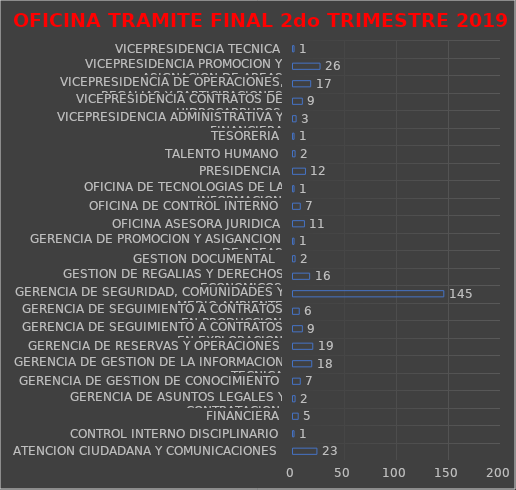
| Category | Series 0 |
|---|---|
| ATENCION CIUDADANA Y COMUNICACIONES | 23 |
| CONTROL INTERNO DISCIPLINARIO | 1 |
| FINANCIERA | 5 |
| GERENCIA DE ASUNTOS LEGALES Y CONTRATACION | 2 |
| GERENCIA DE GESTION DE CONOCIMIENTO | 7 |
| GERENCIA DE GESTION DE LA INFORMACION TECNICA | 18 |
| GERENCIA DE RESERVAS Y OPERACIONES | 19 |
| GERENCIA DE SEGUIMIENTO A CONTRATOS EN EXPLORACION | 9 |
| GERENCIA DE SEGUIMIENTO A CONTRATOS EN PRODUCCION | 6 |
| GERENCIA DE SEGURIDAD, COMUNIDADES Y MEDIO AMBIENTE | 145 |
| GESTION DE REGALIAS Y DERECHOS ECONOMICOS | 16 |
| GESTION DOCUMENTAL  | 2 |
| GERENCIA DE PROMOCION Y ASIGANCION DE AREAS | 1 |
| OFICINA ASESORA JURIDICA | 11 |
| OFICINA DE CONTROL INTERNO | 7 |
| OFICINA DE TECNOLOGIAS DE LA INFORMACION | 1 |
| PRESIDENCIA | 12 |
| TALENTO HUMANO | 2 |
| TESORERIA | 1 |
| VICEPRESIDENCIA ADMINISTRATIVA Y FINANCIERA | 3 |
| VICEPRESIDENCIA CONTRATOS DE HIDROCARBUROS | 9 |
| VICEPRESIDENCIA DE OPERACIONES, REGALIAS Y PARTICIPACIONES | 17 |
| VICEPRESIDENCIA PROMOCION Y ASIGNACION DE AREAS | 26 |
| VICEPRESIDENCIA TECNICA | 1 |